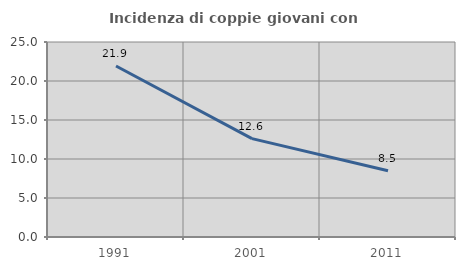
| Category | Incidenza di coppie giovani con figli |
|---|---|
| 1991.0 | 21.922 |
| 2001.0 | 12.612 |
| 2011.0 | 8.485 |